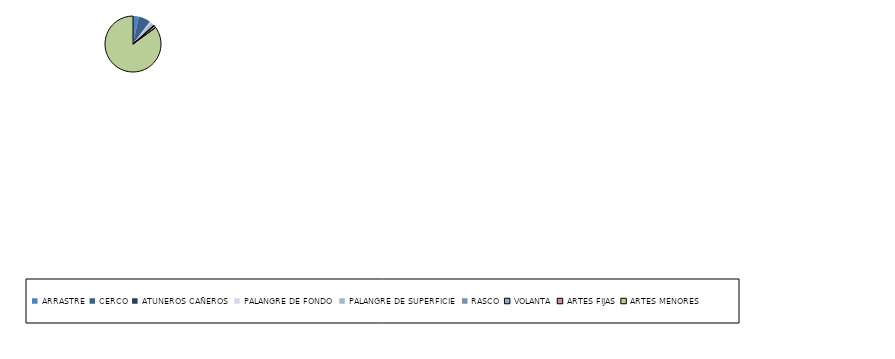
| Category | Series 0 |
|---|---|
| ARRASTRE | 8 |
| CERCO | 16 |
| ATUNEROS CAÑEROS | 1 |
| PALANGRE DE FONDO | 2 |
| PALANGRE DE SUPERFICIE | 4 |
| RASCO | 1 |
| VOLANTA | 1 |
| ARTES FIJAS | 3 |
| ARTES MENORES | 204 |